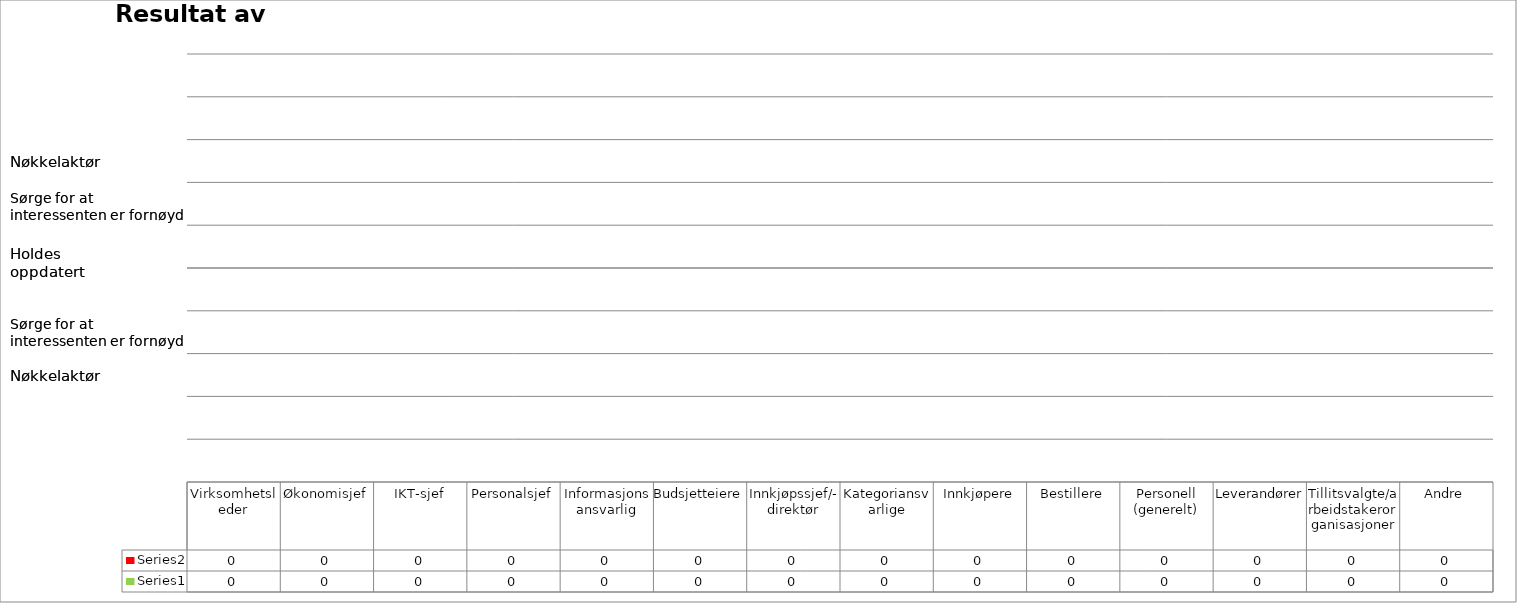
| Category | Series 1 | Series 0 |
|---|---|---|
| Virksomhetsleder | 0 | 0 |
| Økonomisjef | 0 | 0 |
| IKT-sjef | 0 | 0 |
| Personalsjef | 0 | 0 |
| Informasjonsansvarlig | 0 | 0 |
| Budsjetteiere | 0 | 0 |
| Innkjøpssjef/-direktør | 0 | 0 |
| Kategoriansvarlige | 0 | 0 |
| Innkjøpere | 0 | 0 |
| Bestillere | 0 | 0 |
| Personell (generelt) | 0 | 0 |
| Leverandører | 0 | 0 |
| Tillitsvalgte/arbeidstakerorganisasjoner | 0 | 0 |
| Andre | 0 | 0 |